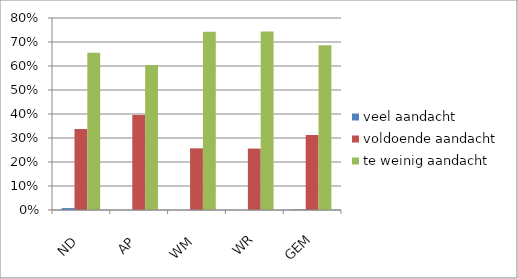
| Category | veel aandacht | voldoende aandacht | te weinig aandacht |
|---|---|---|---|
| ND | 0.008 | 0.337 | 0.655 |
| AP | 0 | 0.396 | 0.604 |
| WM | 0 | 0.257 | 0.743 |
| WR | 0 | 0.256 | 0.744 |
| GEM | 0.002 | 0.312 | 0.686 |